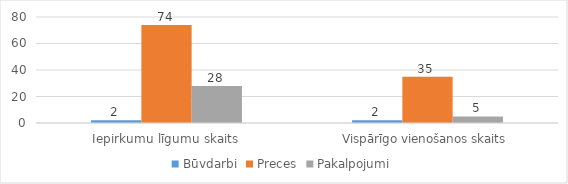
| Category | Būvdarbi | Preces | Pakalpojumi |
|---|---|---|---|
| Iepirkumu līgumu skaits | 2 | 74 | 28 |
| Vispārīgo vienošanos skaits | 2 | 35 | 5 |